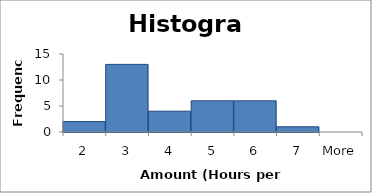
| Category | Frequency |
|---|---|
| 2 | 2 |
| 3 | 13 |
| 4 | 4 |
| 5 | 6 |
| 6 | 6 |
| 7 | 1 |
| More | 0 |